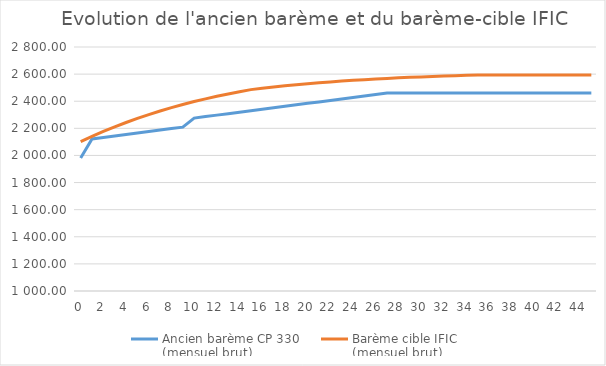
| Category | Ancien barème CP 330 
(mensuel brut) | Barème cible | Barème cible IFIC 
(mensuel brut) |
|---|---|---|---|
| 0.0 | 1980.59 |  | 2101.97 |
| 1.0 | 2121.98 |  | 2140.54 |
| 2.0 | 2132.84 |  | 2176.87 |
| 3.0 | 2143.7 |  | 2211.04 |
| 4.0 | 2154.55 |  | 2243.14 |
| 5.0 | 2165.41 |  | 2273.28 |
| 6.0 | 2176.26 |  | 2301.52 |
| 7.0 | 2187.11 |  | 2327.96 |
| 8.0 | 2197.97 |  | 2352.7 |
| 9.0 | 2208.83 |  | 2375.84 |
| 10.0 | 2275.66 |  | 2397.44 |
| 11.0 | 2286.51 |  | 2417.61 |
| 12.0 | 2297.37 |  | 2436.42 |
| 13.0 | 2308.23 |  | 2453.95 |
| 14.0 | 2319.08 |  | 2470.29 |
| 15.0 | 2329.94 |  | 2485.51 |
| 16.0 | 2340.79 |  | 2495.56 |
| 17.0 | 2351.65 |  | 2504.9 |
| 18.0 | 2362.5 |  | 2513.57 |
| 19.0 | 2373.36 |  | 2521.62 |
| 20.0 | 2384.22 |  | 2529.1 |
| 21.0 | 2395.07 |  | 2536.02 |
| 22.0 | 2405.92 |  | 2542.44 |
| 23.0 | 2416.78 |  | 2548.41 |
| 24.0 | 2427.64 |  | 2553.94 |
| 25.0 | 2438.49 |  | 2559.06 |
| 26.0 | 2449.35 |  | 2563.81 |
| 27.0 | 2460.2 |  | 2568.2 |
| 28.0 | 2460.2 |  | 2572.29 |
| 29.0 | 2460.2 |  | 2576.06 |
| 30.0 | 2460.2 |  | 2579.56 |
| 31.0 | 2460.2 |  | 2582.8 |
| 32.0 | 2460.2 |  | 2585.8 |
| 33.0 | 2460.2 |  | 2588.58 |
| 34.0 | 2460.2 |  | 2591.16 |
| 35.0 | 2460.2 |  | 2593.54 |
| 36.0 | 2460.2 |  | 2593.54 |
| 37.0 | 2460.2 |  | 2593.54 |
| 38.0 | 2460.2 |  | 2593.54 |
| 39.0 | 2460.2 |  | 2593.54 |
| 40.0 | 2460.2 |  | 2593.54 |
| 41.0 | 2460.2 |  | 2593.54 |
| 42.0 | 2460.2 |  | 2593.54 |
| 43.0 | 2460.2 |  | 2593.54 |
| 44.0 | 2460.2 |  | 2593.54 |
| 45.0 | 2460.2 |  | 2593.54 |